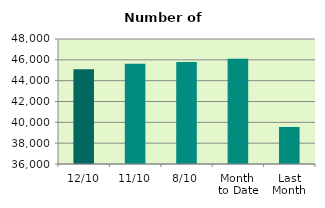
| Category | Series 0 |
|---|---|
| 12/10 | 45090 |
| 11/10 | 45616 |
| 8/10 | 45786 |
| Month 
to Date | 46093.75 |
| Last
Month | 39557.091 |